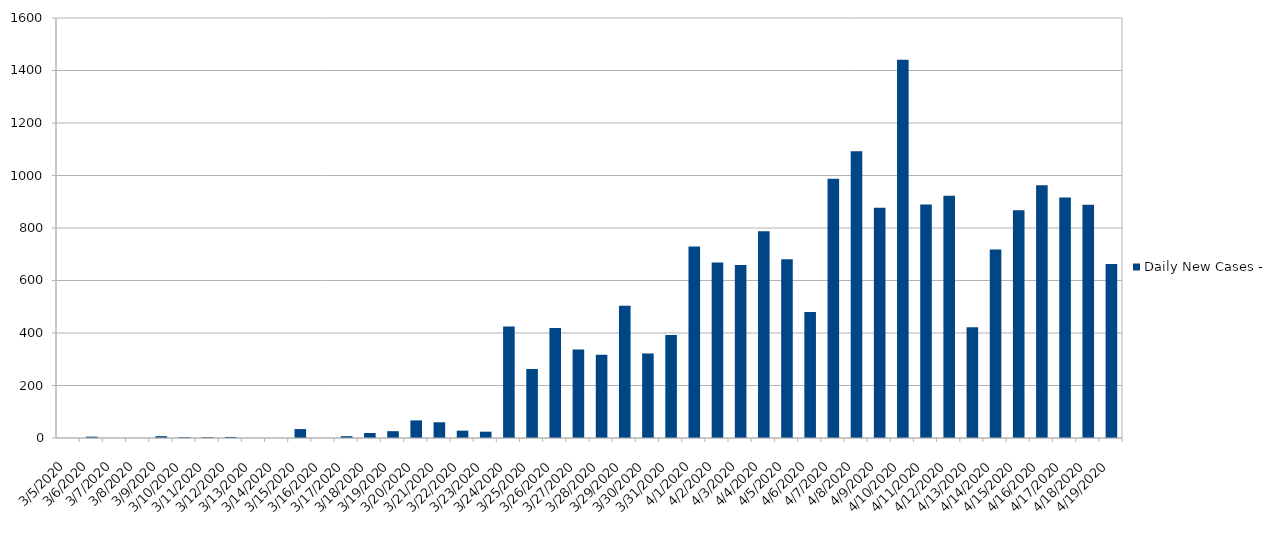
| Category | Daily New Cases - |
|---|---|
| 3/5/2020 | 0 |
| 3/6/2020 | 5 |
| 3/7/2020 | 0 |
| 3/8/2020 | 0 |
| 3/9/2020 | 7 |
| 3/10/2020 | 3 |
| 3/11/2020 | 3 |
| 3/12/2020 | 4 |
| 3/13/2020 | 0 |
| 3/14/2020 | 0 |
| 3/15/2020 | 34 |
| 3/16/2020 | 0 |
| 3/17/2020 | 7 |
| 3/18/2020 | 19 |
| 3/19/2020 | 26 |
| 3/20/2020 | 67 |
| 3/21/2020 | 60 |
| 3/22/2020 | 28 |
| 3/23/2020 | 24 |
| 3/24/2020 | 425 |
| 3/25/2020 | 263 |
| 3/26/2020 | 419 |
| 3/27/2020 | 337 |
| 3/28/2020 | 317 |
| 3/29/2020 | 504 |
| 3/30/2020 | 322 |
| 3/31/2020 | 392 |
| 4/1/2020 | 730 |
| 4/2/2020 | 669 |
| 4/3/2020 | 659 |
| 4/4/2020 | 788 |
| 4/5/2020 | 681 |
| 4/6/2020 | 480 |
| 4/7/2020 | 988 |
| 4/8/2020 | 1092 |
| 4/9/2020 | 877 |
| 4/10/2020 | 1441 |
| 4/11/2020 | 890 |
| 4/12/2020 | 923 |
| 4/13/2020 | 422 |
| 4/14/2020 | 718 |
| 4/15/2020 | 868 |
| 4/16/2020 | 963 |
| 4/17/2020 | 916 |
| 4/18/2020 | 889 |
| 4/19/2020 | 663 |